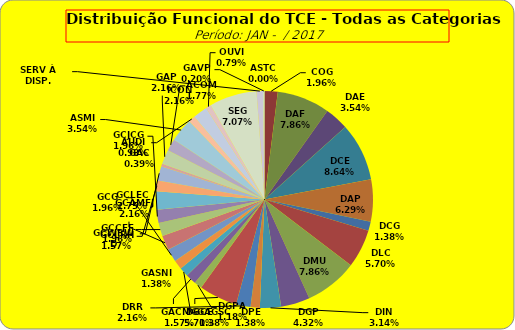
| Category | ASTC |
|---|---|
| ASTC | 0 |
| COG | 10 |
| DAF | 40 |
| DAE | 18 |
| DCE | 44 |
| DAP | 32 |
| DCG | 7 |
| DLC | 29 |
| DMU | 40 |
| DGP | 22 |
| DIN | 16 |
| DPE | 7 |
| DRR | 11 |
| DGCE | 29 |
| DGPA | 6 |
| GACMG | 8 |
| GAGSC | 7 |
| GASNI | 7 |
| GCG | 10 |
| GCAMFJ | 11 |
| GCCFF | 10 |
| GCJCG | 10 |
| GCLEC | 14 |
| GCLRH | 8 |
| GCWRWD | 11 |
| GAC | 2 |
| GAP | 11 |
| ACOM | 9 |
| ASMI | 18 |
| AUDI | 5 |
| ICON | 11 |
| OUVI | 4 |
| SEG | 36 |
| SERV À DISP. | 5 |
| GAVP | 1 |